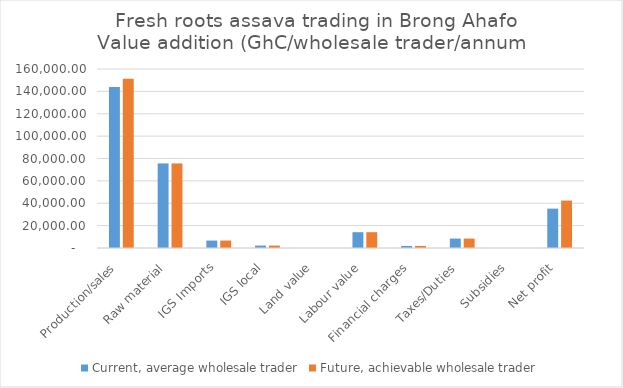
| Category | Current, average wholesale trader | Future, achievable wholesale trader |
|---|---|---|
| Production/sales | 144000 | 151200 |
| Raw material | 75600 | 75600 |
| IGS Imports | 6637.5 | 6637.5 |
| IGS local | 2175 | 2175 |
| Land value | 0 | 0 |
| Labour value | 14131.25 | 14131.25 |
| Financial charges | 1837.5 | 1837.5 |
| Taxes/Duties | 8429.75 | 8429.75 |
| Subsidies | 0 | 0 |
| Net profit | 35189 | 42389 |